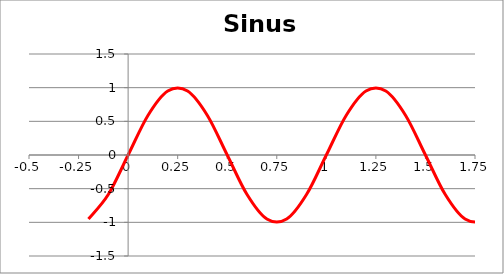
| Category |   Sinus ωt |
|---|---|
| -0.2 | -0.951 |
| -0.1 | -0.588 |
| 0.0 | 0 |
| 0.1 | 0.588 |
| 0.2 | 0.951 |
| 0.30000000000000004 | 0.951 |
| 0.4 | 0.588 |
| 0.5 | 0 |
| 0.6 | -0.588 |
| 0.7 | -0.951 |
| 0.7999999999999999 | -0.951 |
| 0.8999999999999999 | -0.588 |
| 0.9999999999999999 | 0 |
| 1.0999999999999999 | 0.588 |
| 1.2 | 0.951 |
| 1.3 | 0.951 |
| 1.4000000000000001 | 0.588 |
| 1.5000000000000002 | 0 |
| 1.6000000000000003 | -0.588 |
| 1.7000000000000004 | -0.951 |
| 1.8000000000000005 | -0.951 |
| 1.9000000000000006 | -0.588 |
| 2.0000000000000004 | 0 |
| 2.1000000000000005 | 0.588 |
| 2.2000000000000006 | 0.951 |
| 2.3000000000000007 | 0.951 |
| 2.400000000000001 | 0.588 |
| 2.500000000000001 | 0 |